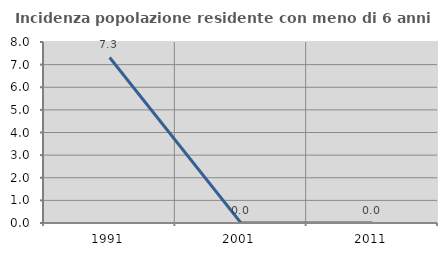
| Category | Incidenza popolazione residente con meno di 6 anni |
|---|---|
| 1991.0 | 7.317 |
| 2001.0 | 0 |
| 2011.0 | 0 |